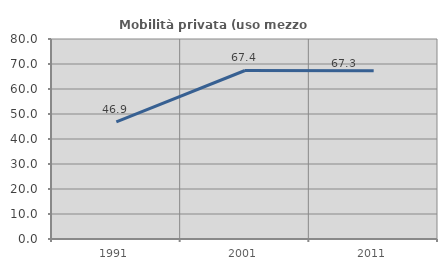
| Category | Mobilità privata (uso mezzo privato) |
|---|---|
| 1991.0 | 46.875 |
| 2001.0 | 67.401 |
| 2011.0 | 67.299 |